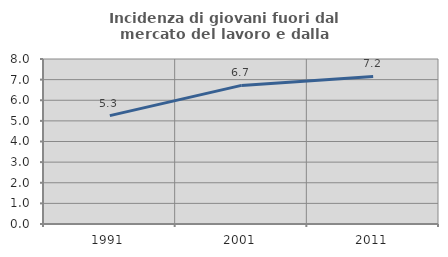
| Category | Incidenza di giovani fuori dal mercato del lavoro e dalla formazione  |
|---|---|
| 1991.0 | 5.256 |
| 2001.0 | 6.72 |
| 2011.0 | 7.152 |